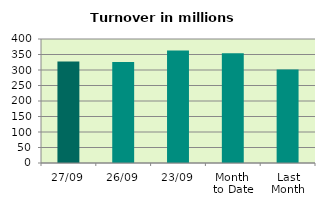
| Category | Series 0 |
|---|---|
| 27/09 | 327.778 |
| 26/09 | 325.424 |
| 23/09 | 362.898 |
| Month 
to Date | 353.821 |
| Last
Month | 301.741 |